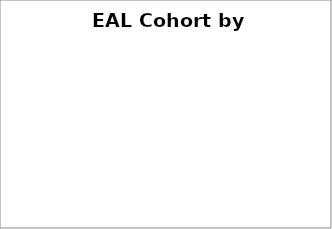
| Category | Series 0 | Series 1 |
|---|---|---|
| boys | 0 |  |
| girls | 0 |  |